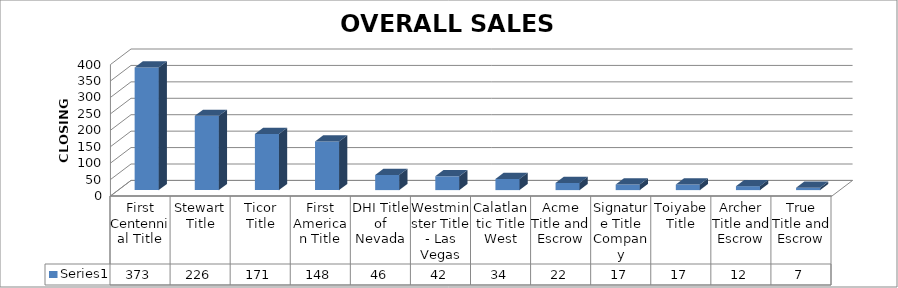
| Category | Series 0 |
|---|---|
| First Centennial Title | 373 |
| Stewart Title | 226 |
| Ticor Title | 171 |
| First American Title | 148 |
| DHI Title of Nevada | 46 |
| Westminster Title - Las Vegas | 42 |
| Calatlantic Title West | 34 |
| Acme Title and Escrow | 22 |
| Signature Title Company | 17 |
| Toiyabe Title | 17 |
| Archer Title and Escrow | 12 |
| True Title and Escrow | 7 |